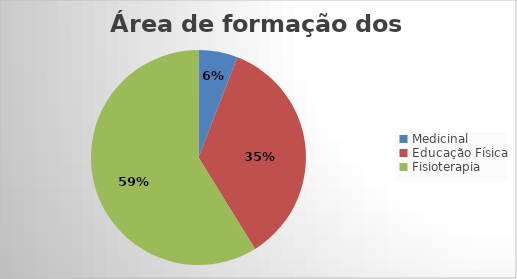
| Category | Series 0 |
|---|---|
| Medicinal | 1 |
| Educação Física | 6 |
| Fisioterapia | 10 |